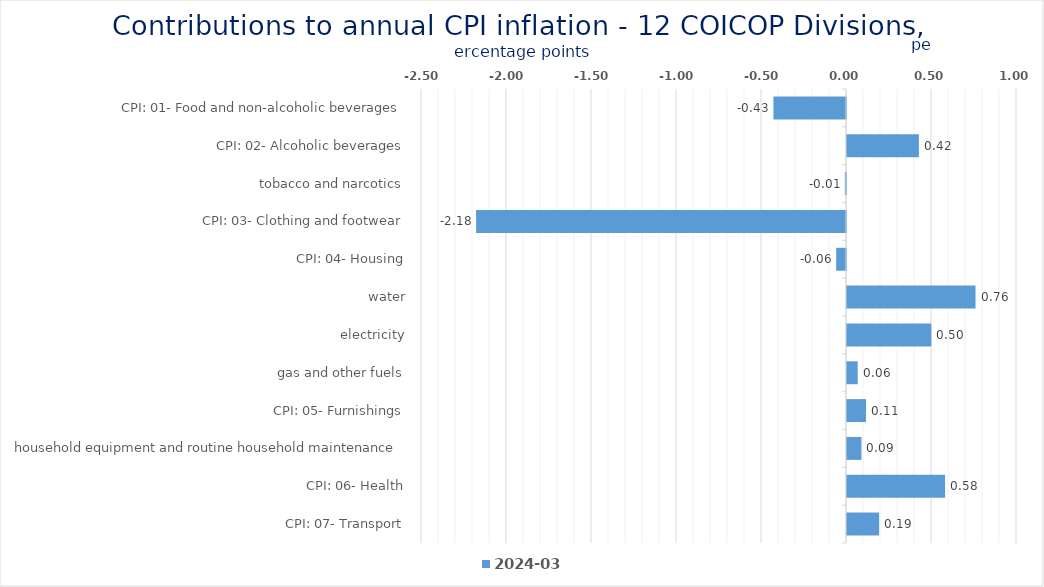
| Category | 2024-03 |
|---|---|
| CPI: 01- Food and non-alcoholic beverages | -0.427 |
| CPI: 02- Alcoholic beverages, tobacco and narcotics | 0.423 |
| CPI: 03- Clothing and footwear | -0.007 |
| CPI: 04- Housing, water, electricity, gas and other fuels | -2.176 |
| CPI: 05- Furnishings, household equipment and routine household maintenance | -0.058 |
| CPI: 06- Health | 0.756 |
| CPI: 07- Transport | 0.496 |
| CPI: 08- Communication | 0.063 |
| CPI: 09- Recreation and culture | 0.112 |
| CPI: 10- Education | 0.085 |
| CPI: 11- Restaurants and hotels | 0.577 |
| CPI: 12- Miscellaneous goods and services | 0.189 |